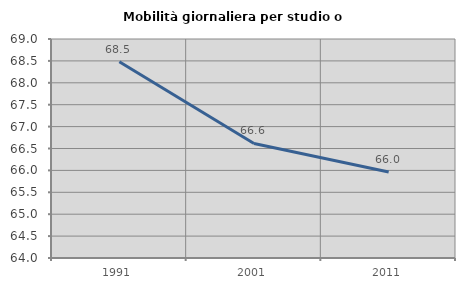
| Category | Mobilità giornaliera per studio o lavoro |
|---|---|
| 1991.0 | 68.48 |
| 2001.0 | 66.616 |
| 2011.0 | 65.964 |